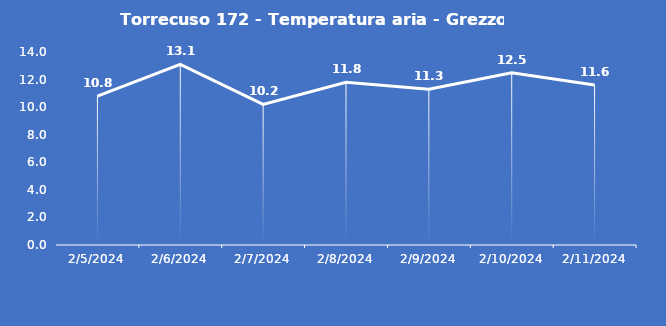
| Category | Torrecuso 172 - Temperatura aria - Grezzo (°C) |
|---|---|
| 2/5/24 | 10.8 |
| 2/6/24 | 13.1 |
| 2/7/24 | 10.2 |
| 2/8/24 | 11.8 |
| 2/9/24 | 11.3 |
| 2/10/24 | 12.5 |
| 2/11/24 | 11.6 |